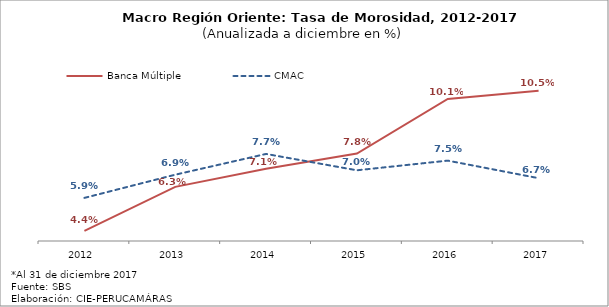
| Category | Banca Múltiple | CMAC |
|---|---|---|
| 2012.0 | 0.044 | 0.059 |
| 2013.0 | 0.063 | 0.069 |
| 2014.0 | 0.071 | 0.077 |
| 2015.0 | 0.078 | 0.07 |
| 2016.0 | 0.101 | 0.075 |
| 2017.0 | 0.105 | 0.067 |